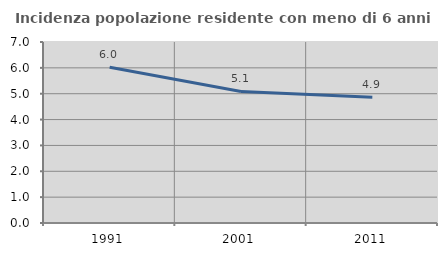
| Category | Incidenza popolazione residente con meno di 6 anni |
|---|---|
| 1991.0 | 6.024 |
| 2001.0 | 5.088 |
| 2011.0 | 4.862 |